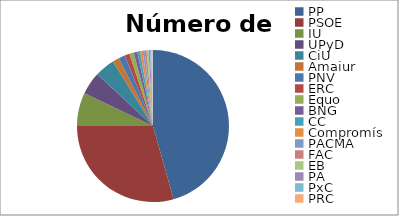
| Category | % | Votos |
|---|---|---|
| PP | 0.446 | 10866566 |
| PSOE | 0.288 | 7003511 |
| IU | 0.069 | 1685991 |
| UPyD | 0.047 | 1143225 |
| CiU | 0.042 | 1015691 |
| Amaiur | 0.014 | 334498 |
| PNV | 0.013 | 324317 |
| ERC | 0.01 | 256393 |
| Equo | 0.009 | 216748 |
| BNG | 0.008 | 184037 |
| CC | 0.006 | 143881 |
| Compromís | 0.005 | 125306 |
| PACMA | 0.004 | 102144 |
| FAC | 0.004 | 99473 |
| EB | 0.004 | 97673 |
| PA | 0.003 | 76999 |
| PxC | 0.002 | 59949 |
| PRC | 0.002 | 44010 |
| GB | 0.002 | 42415 |